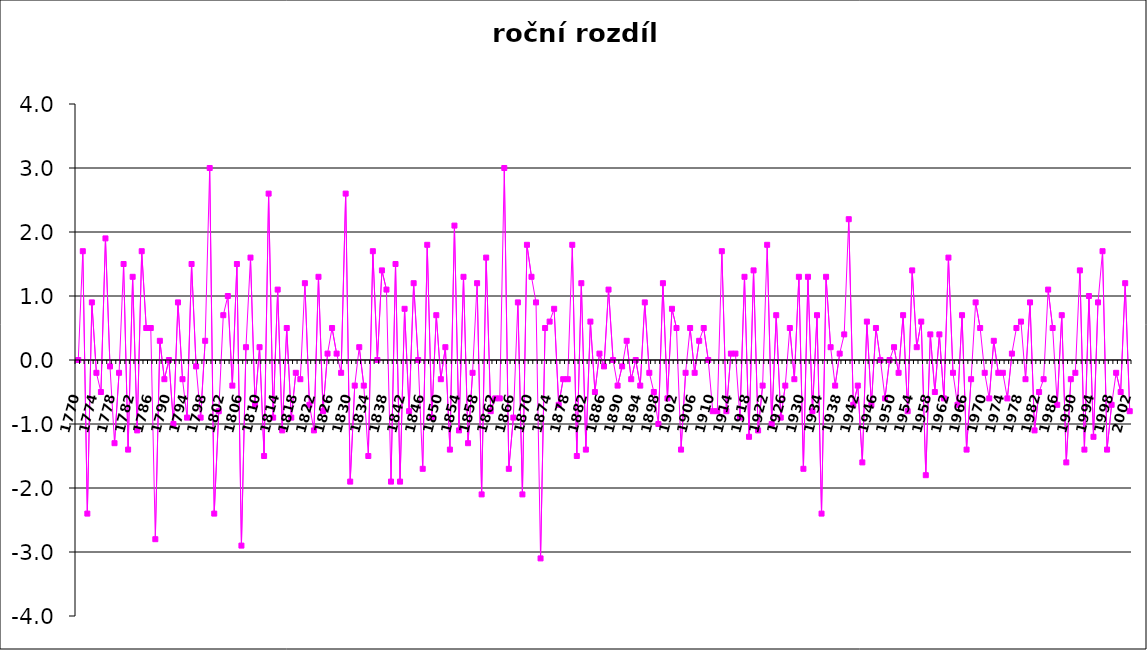
| Category | rozdíl |
|---|---|
| 1770.0 | 0 |
| 1771.0 | 1.7 |
| 1772.0 | -2.4 |
| 1773.0 | 0.9 |
| 1774.0 | -0.2 |
| 1775.0 | -0.5 |
| 1776.0 | 1.9 |
| 1777.0 | -0.1 |
| 1778.0 | -1.3 |
| 1779.0 | -0.2 |
| 1780.0 | 1.5 |
| 1781.0 | -1.4 |
| 1782.0 | 1.3 |
| 1783.0 | -1.1 |
| 1784.0 | 1.7 |
| 1785.0 | 0.5 |
| 1786.0 | 0.5 |
| 1787.0 | -2.8 |
| 1788.0 | 0.3 |
| 1789.0 | -0.3 |
| 1790.0 | 0 |
| 1791.0 | -1 |
| 1792.0 | 0.9 |
| 1793.0 | -0.3 |
| 1794.0 | -0.9 |
| 1795.0 | 1.5 |
| 1796.0 | -0.1 |
| 1797.0 | -0.9 |
| 1798.0 | 0.3 |
| 1799.0 | 3 |
| 1800.0 | -2.4 |
| 1801.0 | -0.8 |
| 1802.0 | 0.7 |
| 1803.0 | 1 |
| 1804.0 | -0.4 |
| 1805.0 | 1.5 |
| 1806.0 | -2.9 |
| 1807.0 | 0.2 |
| 1808.0 | 1.6 |
| 1809.0 | -0.7 |
| 1810.0 | 0.2 |
| 1811.0 | -1.5 |
| 1812.0 | 2.6 |
| 1813.0 | -0.9 |
| 1814.0 | 1.1 |
| 1815.0 | -1.1 |
| 1816.0 | 0.5 |
| 1817.0 | -0.9 |
| 1818.0 | -0.2 |
| 1819.0 | -0.3 |
| 1820.0 | 1.2 |
| 1821.0 | -0.7 |
| 1822.0 | -1.1 |
| 1823.0 | 1.3 |
| 1824.0 | -0.8 |
| 1825.0 | 0.1 |
| 1826.0 | 0.5 |
| 1827.0 | 0.1 |
| 1828.0 | -0.2 |
| 1829.0 | 2.6 |
| 1830.0 | -1.9 |
| 1831.0 | -0.4 |
| 1832.0 | 0.2 |
| 1833.0 | -0.4 |
| 1834.0 | -1.5 |
| 1835.0 | 1.7 |
| 1836.0 | 0 |
| 1837.0 | 1.4 |
| 1838.0 | 1.1 |
| 1839.0 | -1.9 |
| 1840.0 | 1.5 |
| 1841.0 | -1.9 |
| 1842.0 | 0.8 |
| 1843.0 | -0.8 |
| 1844.0 | 1.2 |
| 1845.0 | 0 |
| 1846.0 | -1.7 |
| 1847.0 | 1.8 |
| 1848.0 | -0.9 |
| 1849.0 | 0.7 |
| 1850.0 | -0.3 |
| 1851.0 | 0.2 |
| 1852.0 | -1.4 |
| 1853.0 | 2.1 |
| 1854.0 | -1.1 |
| 1855.0 | 1.3 |
| 1856.0 | -1.3 |
| 1857.0 | -0.2 |
| 1858.0 | 1.2 |
| 1859.0 | -2.1 |
| 1860.0 | 1.6 |
| 1861.0 | -0.8 |
| 1862.0 | -0.6 |
| 1863.0 | -0.6 |
| 1864.0 | 3 |
| 1865.0 | -1.7 |
| 1866.0 | -0.9 |
| 1867.0 | 0.9 |
| 1868.0 | -2.1 |
| 1869.0 | 1.8 |
| 1870.0 | 1.3 |
| 1871.0 | 0.9 |
| 1872.0 | -3.1 |
| 1873.0 | 0.5 |
| 1874.0 | 0.6 |
| 1875.0 | 0.8 |
| 1876.0 | -0.7 |
| 1877.0 | -0.3 |
| 1878.0 | -0.3 |
| 1879.0 | 1.8 |
| 1880.0 | -1.5 |
| 1881.0 | 1.2 |
| 1882.0 | -1.4 |
| 1883.0 | 0.6 |
| 1884.0 | -0.5 |
| 1885.0 | 0.1 |
| 1886.0 | -0.1 |
| 1887.0 | 1.1 |
| 1888.0 | 0 |
| 1889.0 | -0.4 |
| 1890.0 | -0.1 |
| 1891.0 | 0.3 |
| 1892.0 | -0.3 |
| 1893.0 | 0 |
| 1894.0 | -0.4 |
| 1895.0 | 0.9 |
| 1896.0 | -0.2 |
| 1897.0 | -0.5 |
| 1898.0 | -1 |
| 1899.0 | 1.2 |
| 1900.0 | -0.6 |
| 1901.0 | 0.8 |
| 1902.0 | 0.5 |
| 1903.0 | -1.4 |
| 1904.0 | -0.2 |
| 1905.0 | 0.5 |
| 1906.0 | -0.2 |
| 1907.0 | 0.3 |
| 1908.0 | 0.5 |
| 1909.0 | 0 |
| 1910.0 | -0.8 |
| 1911.0 | -0.8 |
| 1912.0 | 1.7 |
| 1913.0 | -0.8 |
| 1914.0 | 0.1 |
| 1915.0 | 0.1 |
| 1916.0 | -0.9 |
| 1917.0 | 1.3 |
| 1918.0 | -1.2 |
| 1919.0 | 1.4 |
| 1920.0 | -1.1 |
| 1921.0 | -0.4 |
| 1922.0 | 1.8 |
| 1923.0 | -1 |
| 1924.0 | 0.7 |
| 1925.0 | -0.9 |
| 1926.0 | -0.4 |
| 1927.0 | 0.5 |
| 1928.0 | -0.3 |
| 1929.0 | 1.3 |
| 1930.0 | -1.7 |
| 1931.0 | 1.3 |
| 1932.0 | -0.8 |
| 1933.0 | 0.7 |
| 1934.0 | -2.4 |
| 1935.0 | 1.3 |
| 1936.0 | 0.2 |
| 1937.0 | -0.4 |
| 1938.0 | 0.1 |
| 1939.0 | 0.4 |
| 1940.0 | 2.2 |
| 1941.0 | -0.7 |
| 1942.0 | -0.4 |
| 1943.0 | -1.6 |
| 1944.0 | 0.6 |
| 1945.0 | -0.7 |
| 1946.0 | 0.5 |
| 1947.0 | 0 |
| 1948.0 | -0.6 |
| 1949.0 | 0 |
| 1950.0 | 0.2 |
| 1951.0 | -0.2 |
| 1952.0 | 0.7 |
| 1953.0 | -0.8 |
| 1954.0 | 1.4 |
| 1955.0 | 0.2 |
| 1956.0 | 0.6 |
| 1957.0 | -1.8 |
| 1958.0 | 0.4 |
| 1959.0 | -0.5 |
| 1960.0 | 0.4 |
| 1961.0 | -0.6 |
| 1962.0 | 1.6 |
| 1963.0 | -0.2 |
| 1964.0 | -0.7 |
| 1965.0 | 0.7 |
| 1966.0 | -1.4 |
| 1967.0 | -0.3 |
| 1968.0 | 0.9 |
| 1969.0 | 0.5 |
| 1970.0 | -0.2 |
| 1971.0 | -0.6 |
| 1972.0 | 0.3 |
| 1973.0 | -0.2 |
| 1974.0 | -0.2 |
| 1975.0 | -0.6 |
| 1976.0 | 0.1 |
| 1977.0 | 0.5 |
| 1978.0 | 0.6 |
| 1979.0 | -0.3 |
| 1980.0 | 0.9 |
| 1981.0 | -1.1 |
| 1982.0 | -0.5 |
| 1983.0 | -0.3 |
| 1984.0 | 1.1 |
| 1985.0 | 0.5 |
| 1986.0 | -0.7 |
| 1987.0 | 0.7 |
| 1988.0 | -1.6 |
| 1989.0 | -0.3 |
| 1990.0 | -0.2 |
| 1991.0 | 1.4 |
| 1992.0 | -1.4 |
| 1993.0 | 1 |
| 1994.0 | -1.2 |
| 1995.0 | 0.9 |
| 1996.0 | 1.7 |
| 1997.0 | -1.4 |
| 1998.0 | -0.7 |
| 1999.0 | -0.2 |
| 2000.0 | -0.5 |
| 2001.0 | 1.2 |
| 2002.0 | -0.8 |